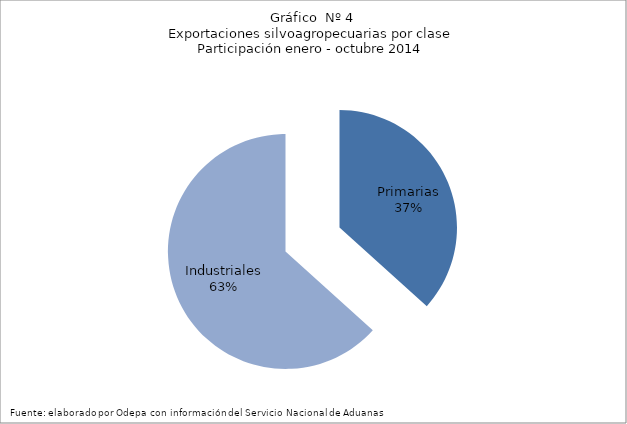
| Category | Series 0 |
|---|---|
| Primarias | 4937084 |
| Industriales | 8526713 |